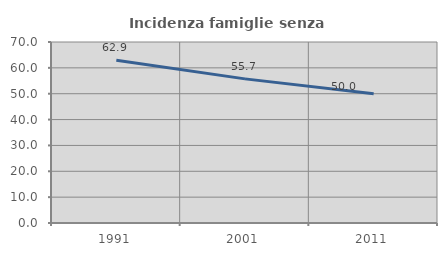
| Category | Incidenza famiglie senza nuclei |
|---|---|
| 1991.0 | 62.903 |
| 2001.0 | 55.738 |
| 2011.0 | 50 |